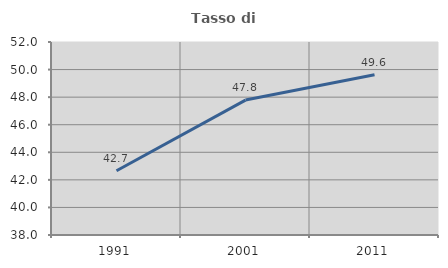
| Category | Tasso di occupazione   |
|---|---|
| 1991.0 | 42.661 |
| 2001.0 | 47.786 |
| 2011.0 | 49.619 |